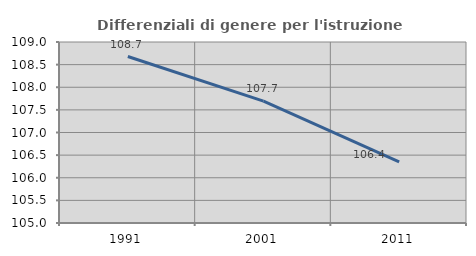
| Category | Differenziali di genere per l'istruzione superiore |
|---|---|
| 1991.0 | 108.679 |
| 2001.0 | 107.692 |
| 2011.0 | 106.353 |